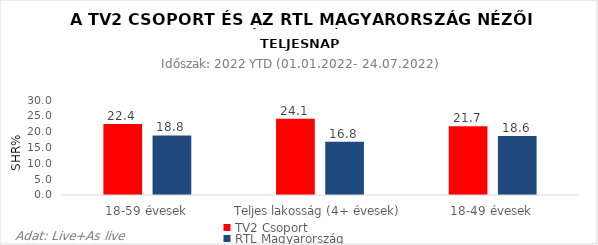
| Category | TV2 Csoport | RTL Magyarország |
|---|---|---|
| 18-59 évesek | 22.4 | 18.8 |
| Teljes lakosság (4+ évesek) | 24.1 | 16.8 |
| 18-49 évesek | 21.7 | 18.6 |